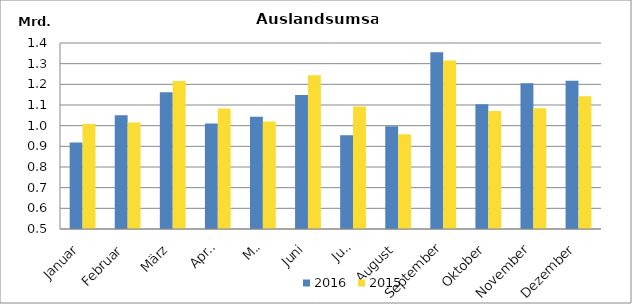
| Category | 2016 | 2015 |
|---|---|---|
| Januar | 919038.02 | 1008311.885 |
| Februar | 1049965.451 | 1015772.862 |
| März | 1162014.818 | 1215952.094 |
| April | 1010153.751 | 1082513.756 |
| Mai | 1042734.717 | 1020764.531 |
| Juni | 1148913.635 | 1244082.073 |
| Juli | 953254.968 | 1092748.727 |
| August | 997458.847 | 958683.875 |
| September | 1354640.254 | 1315655.364 |
| Oktober | 1103060.459 | 1071226.845 |
| November | 1204757.539 | 1084754.923 |
| Dezember | 1217409.981 | 1141821.956 |